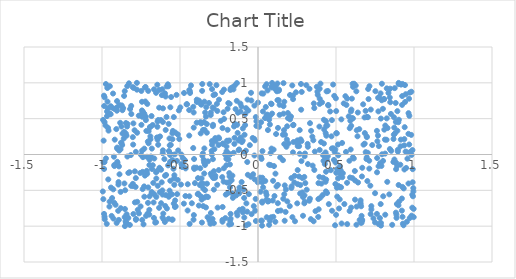
| Category | Series 0 |
|---|---|
| -0.7419592622740621 | 0.526 |
| -0.9224574481947303 | 0.639 |
| 0.9900379126059211 | 0.062 |
| 0.19145734107048473 | 0.579 |
| -0.692896978792227 | 0.382 |
| 0.6516120970148616 | -0.913 |
| -0.27252018202302786 | 0.186 |
| -0.37912200148637587 | -0.713 |
| 0.09034018760713414 | 0.998 |
| 0.5018132377319626 | -0.256 |
| -0.4097528813850355 | -0.063 |
| -0.9824699931598047 | -0.903 |
| 0.3877731138392537 | -0.399 |
| -0.35336066891110995 | 0.014 |
| 0.8254445727422417 | 0.923 |
| -0.8583453792873337 | 0.817 |
| 0.3503063440896721 | -0.155 |
| 0.8964751538222178 | 0.065 |
| 0.2885108013693589 | -0.855 |
| -0.9615182491556808 | 0.372 |
| -0.031243224011669346 | -0.276 |
| -0.3422164671219323 | 0.345 |
| -0.17495520618168836 | 0.922 |
| -0.8753606695693186 | 0.158 |
| -0.1535201118132965 | 0.391 |
| -0.2866530294697187 | -0.327 |
| -0.5730128356004565 | -0.897 |
| 0.7700742871777879 | 0.791 |
| -0.9352018048384272 | -0.608 |
| -0.19630874496795991 | -0.063 |
| 0.43960734681137104 | 0.881 |
| 0.809773972155627 | 0.347 |
| 0.1788386683228662 | -0.488 |
| 0.19586711586748673 | 0.154 |
| 0.06978973091221707 | -0.648 |
| -0.17991345490271704 | -0.457 |
| -0.8962989645703552 | -0.786 |
| -0.4650686677911722 | -0.579 |
| 0.17706164323828966 | -0.801 |
| -0.1128817470160759 | 0.71 |
| 0.11593899216185988 | 0.286 |
| 0.6158778797288358 | 0.988 |
| 0.054902587526479474 | -0.626 |
| 0.09667712032185727 | -0.367 |
| -0.18998940927837182 | -0.067 |
| -0.36294791596726417 | -0.403 |
| 0.20945528475894415 | 0.53 |
| 0.7881853355961057 | -0.992 |
| -0.8214644644003504 | -0.982 |
| -0.010057948386060334 | 0.464 |
| 0.9682957967996926 | 0.779 |
| 0.1620982211717037 | -0.617 |
| 0.5874195479520883 | -0.788 |
| -0.0620055426670143 | 0.614 |
| 0.21534800907295204 | -0.444 |
| -0.3672210025007123 | 0.295 |
| -0.2956415627918587 | 0.187 |
| -0.34567018217071266 | 0.453 |
| 0.298047839615762 | -0.57 |
| 0.05594308001573278 | -0.876 |
| -0.45802404658706375 | 0.7 |
| 0.4278964595079453 | -0.012 |
| -0.5619877390562702 | -0.556 |
| 0.8446974542959942 | 0.795 |
| 0.2785121831598616 | 0.187 |
| 0.8686584559352868 | 0.216 |
| 0.7941696146942545 | 0.987 |
| -0.5139606106078609 | 0.28 |
| -0.08814985319120949 | 0.024 |
| 0.12759738108346141 | -0.789 |
| -0.548787521978384 | -0.077 |
| 0.4472154085294555 | -0.025 |
| -0.3925031021179801 | 0.765 |
| 0.9124205803523109 | -0.143 |
| 0.31995739601439754 | -0.134 |
| -0.2268143012216799 | -0.732 |
| -0.17988417945567603 | -0.139 |
| -0.2910008774741235 | 0.656 |
| 0.41500358745609867 | -0.566 |
| -0.6824204750995548 | 0.537 |
| -0.9895193758236858 | 0.194 |
| -0.27497502581458155 | -0.325 |
| 0.21971282638853795 | 0.964 |
| -0.39290960556371557 | 0.444 |
| -0.8002764583468365 | 0.138 |
| 0.2637070391387264 | 0.116 |
| 0.6740269155728442 | 0.7 |
| -0.019458910715642874 | 0.199 |
| 0.6640934213020522 | -0.857 |
| -0.7248184025264413 | 0.936 |
| 0.18783860464966162 | -0.654 |
| -0.07778779154760862 | 0.053 |
| -0.5275563943293109 | -0.724 |
| -0.7473091323292089 | 0.414 |
| -0.4403549199226702 | 0.901 |
| 0.050552695488453425 | -0.528 |
| -0.22774819788274447 | -0.913 |
| -0.18179694166404992 | 0.707 |
| -0.1755120808628865 | -0.894 |
| 0.11374737613713326 | 0.958 |
| 0.6576050272658365 | -0.64 |
| -0.10571965605305556 | 0.67 |
| -0.6071142607168012 | -0.824 |
| 0.45399896636486825 | -0.692 |
| -0.5633327003689967 | 0.014 |
| 0.09820463811316915 | -0.87 |
| 0.8764020133276933 | 0.926 |
| -0.8581931480453582 | 0.316 |
| 0.2249125465899786 | 0.409 |
| -0.3582649208425792 | 0.888 |
| -0.10994754991100564 | 0.238 |
| -0.8751019522537704 | 0.39 |
| 0.9236885024983961 | 0.692 |
| -0.7011919525157724 | 0.156 |
| 0.08698411601906919 | 0.935 |
| -0.02309381248240916 | 0.682 |
| 0.6303880254238527 | 0.882 |
| -0.6751139364836027 | 0.411 |
| -0.48769725699299027 | -0.161 |
| 0.5054885175382411 | -0.463 |
| 0.8825761310856659 | 0.719 |
| -0.887805955583286 | -0.276 |
| -0.967951449244246 | 0.535 |
| -0.7373472389731623 | -0.037 |
| 0.026527241106605537 | -0.657 |
| 0.7061329814996458 | 0.914 |
| 0.6970741372478362 | -0.039 |
| 0.08093905705897031 | 0.019 |
| 0.5897937588133351 | -0.321 |
| 0.1923222302780132 | 0.507 |
| 0.18226322089184066 | 0.108 |
| -0.5741000127761857 | 0.952 |
| -0.6745292284743007 | -0.15 |
| -0.9393923898162049 | 0.656 |
| -0.03415295217127978 | 0.231 |
| 0.4515115445890019 | 0.684 |
| 0.4734611224209637 | 0.085 |
| -0.32792920189041985 | 0.425 |
| -0.7296527364150573 | -0.445 |
| -0.7397869474919905 | -0.242 |
| -0.0012790730268041894 | -0.388 |
| -0.577844096875173 | 0.979 |
| -0.13535828790830085 | -0.814 |
| -0.883408674532989 | 0.442 |
| 0.6309875293958656 | -0.98 |
| -0.6815280974094218 | -0.523 |
| -0.8119947530338196 | 0.565 |
| -0.5961331758318229 | 0.853 |
| 0.4004543324119392 | 0.989 |
| -0.6400126540349629 | 0.234 |
| -0.1361096204144001 | 0.749 |
| 0.7129101654087611 | -0.087 |
| 0.0637044750343223 | 0.341 |
| 0.5707796038125825 | -0.395 |
| -0.974984362475378 | 0.983 |
| -0.5837825350518167 | -0.753 |
| -0.7747040834856211 | 0.303 |
| 0.5402856334953476 | -0.317 |
| -0.22382896514738038 | 0.148 |
| 0.07135534169504831 | -0.982 |
| -0.8922152247099895 | -0.912 |
| -0.8313634906037779 | -0.886 |
| -0.6334518446544242 | 0.901 |
| 0.30319293733689 | -0.399 |
| 0.4221588835110932 | 0.485 |
| 0.10010675881117925 | 0.068 |
| 0.33290117389380547 | -0.617 |
| 0.4372514379817456 | -0.35 |
| -0.7337979022237249 | -0.974 |
| 0.913770094390314 | 0.114 |
| -0.010443508282033553 | 0.399 |
| 0.330168794611269 | 0.917 |
| 0.02630547750029444 | -0.388 |
| -0.8127948139783667 | -0.438 |
| 0.8933347383594938 | 0.605 |
| 0.7913955921467768 | -0.16 |
| -0.1437405509482239 | 0.633 |
| -0.36107636815228794 | -0.63 |
| 0.07627707393263261 | 0.418 |
| 0.8243399366199311 | 0.205 |
| 0.017558513424116517 | -0.039 |
| -0.25123655802703815 | -0.217 |
| 0.8134030971984172 | 0.208 |
| -0.9291681498835451 | 0.851 |
| 0.7134618145797678 | -0.197 |
| 0.514929787928375 | -0.438 |
| -0.05245249202164115 | 0.131 |
| 0.9954504098552726 | -0.469 |
| 0.3566018756156939 | -0.932 |
| -0.5365211458988692 | -0.423 |
| 0.8779513521450271 | 0.294 |
| 0.1632322606286496 | 0.57 |
| -0.4407655838045834 | 0.264 |
| 0.5127370093158081 | 0.139 |
| 0.7623159255015028 | 0.33 |
| -0.8948185511240181 | -0.419 |
| -0.6209684253541112 | -0.68 |
| 0.7863915257155385 | -0.692 |
| 0.059544213453866845 | 0.557 |
| -0.7428225611085286 | 0.054 |
| 0.7857833601394328 | 0.853 |
| -0.43708105007651477 | 0.882 |
| 0.8156713408371692 | -0.84 |
| -0.511804310198031 | 0.056 |
| -0.738218384755915 | 0.597 |
| -0.5960661894383847 | -0.297 |
| -0.1610276071896577 | -0.605 |
| 0.025851614498179742 | -0.992 |
| -0.4239624952284655 | -0.68 |
| 0.1026426373563647 | -0.162 |
| -0.7173511102701746 | -0.856 |
| 0.127559067741567 | -0.424 |
| -0.7115736108034596 | -0.032 |
| 0.9762979288619922 | 0.035 |
| -0.7438265213786353 | 0.615 |
| 0.560154380101439 | 0.814 |
| -0.3025353979758443 | -0.267 |
| -0.16556683776318826 | -0.542 |
| -0.621152240678519 | -0.212 |
| -0.2827098096729421 | -0.233 |
| -0.5638416392599599 | -0.103 |
| -0.7186987573590755 | 0.48 |
| 0.581806660819671 | 0.532 |
| -0.36870142881255874 | 0.452 |
| -0.798519032306892 | -0.83 |
| 0.649141740314849 | 0.354 |
| -0.4410388042559463 | 0.62 |
| 0.3859792602957075 | -0.871 |
| -0.6089908363230752 | 0.644 |
| 0.5357899938732624 | -0.963 |
| -0.5672853167449958 | 0.224 |
| 0.5004296161573121 | -0.842 |
| -0.42951541070734756 | 0.963 |
| -0.7437732933642593 | 0.736 |
| 0.4958701887380619 | 0.071 |
| -0.014877644562332204 | -0.62 |
| 0.0758799025636756 | -0.924 |
| 0.6904397039231676 | 0.033 |
| -0.639952495731489 | 0.136 |
| -0.9423811537736047 | -0.461 |
| 0.44446976888955647 | 0.405 |
| 0.6682684642435752 | -0.185 |
| 0.4338464027578317 | 0.298 |
| 0.9262972959296287 | -0.869 |
| 0.17331832030953676 | 0.277 |
| -0.17576092053555592 | -0.828 |
| -0.6341034222410065 | -0.744 |
| -0.40960842635361794 | -0.183 |
| 0.050007225352777906 | 0.663 |
| -0.7912020102577184 | 0.338 |
| 0.8159870458338008 | 0.404 |
| -0.7035703283927754 | -0.459 |
| -0.8034327568475383 | 0.94 |
| -0.9130584705123479 | -0.702 |
| 0.022706238876353035 | -0.061 |
| 0.18675297979101435 | 0.394 |
| -0.9028131651422575 | 0.096 |
| 0.08696659688197395 | 0.703 |
| -0.4689183460123947 | -0.079 |
| 0.9402473862712202 | 0.381 |
| -0.4861336423585907 | -0.175 |
| 0.007056439549803617 | 0.387 |
| 0.3952178406643412 | 0.064 |
| -0.609739230747228 | 0.454 |
| -0.8514379171635025 | -0.499 |
| 0.9174452235684616 | 0.975 |
| 0.033798269919053325 | 0.849 |
| -0.4111585970521514 | -0.845 |
| 0.3578191138719926 | 0.712 |
| 0.7638403168579482 | -0.049 |
| 0.8076677540215793 | 0.775 |
| 0.20364509477297577 | -0.721 |
| 0.05496600471319879 | 0.981 |
| -0.15146453833742402 | 0.148 |
| 0.11112122517448242 | -0.939 |
| -0.15583743491845525 | 0.023 |
| 0.6220081169565963 | -0.63 |
| 0.9918717762546907 | -0.205 |
| -0.12048422389815139 | -0.542 |
| -0.2977045962565743 | -0.295 |
| -0.3620233955944354 | 0.716 |
| -0.9696391890473215 | -0.968 |
| 0.1666600596742529 | 0.34 |
| 0.08100258652675474 | -0.148 |
| -0.9645531254994613 | 0.737 |
| 0.9422414405761113 | 0.969 |
| -0.6315876690306728 | -0.185 |
| 0.04510532814318835 | 0.508 |
| -0.7075072465110464 | -0.824 |
| 0.598784249300625 | 0.627 |
| -0.3669979746518406 | -0.583 |
| -0.198421662337519 | -0.392 |
| -0.22082307656954736 | 0.589 |
| -0.16510363691244057 | 0.936 |
| 0.9646711966473391 | -0.405 |
| -0.8014595879657764 | -0.439 |
| 0.02498715642765048 | -0.923 |
| 0.5535954330494945 | -0.691 |
| -0.5309709918463741 | -0.64 |
| -0.33366877566646647 | -0.738 |
| -0.7844382624619928 | -0.452 |
| -0.8024088088856156 | 0.242 |
| 0.5941622351139575 | 0.07 |
| -0.5184954710738077 | -0.553 |
| 0.41059798250057655 | 0.728 |
| 0.24321434167976164 | 0.868 |
| -0.22917295852076713 | -0.315 |
| -0.5590412958205631 | 0.134 |
| -0.20166558756247555 | 0.111 |
| -0.7740478625933485 | -0.66 |
| -0.8736825354793245 | 0.685 |
| -0.8468595314685958 | -0.951 |
| 0.7766195151749276 | 0.799 |
| -0.07432047607166137 | -0.682 |
| 0.9648595279697216 | 0.577 |
| 0.019656616921842396 | -0.923 |
| -0.88048322407087 | -0.522 |
| 0.13266233827820395 | 0.758 |
| 0.9222998934855073 | -0.614 |
| -0.5198356964810276 | -0.089 |
| 0.3932212576582885 | -0.312 |
| -0.2493165914873796 | 0.224 |
| -0.7103194285494352 | -0.269 |
| -0.08871731616362677 | -0.606 |
| 0.7879882488161192 | -0.955 |
| 0.5195921449839127 | -0.753 |
| -0.18408186083649425 | -0.26 |
| 0.15928639344429185 | 0.276 |
| -0.5361000522621282 | -0.289 |
| 0.37701995122662746 | 0.944 |
| -0.7988923646872186 | 0.434 |
| 0.022893289294451336 | 0.853 |
| 0.5052613270919384 | 0.296 |
| -0.8149442885702558 | -0.008 |
| -0.4909253062314327 | -0.134 |
| 0.08342197117659644 | 0.71 |
| -0.34456007891547835 | -0.265 |
| -0.6898794651005367 | 0.253 |
| -0.5719592739502593 | -0.59 |
| 0.4225116966658564 | 0.153 |
| -0.9183649711158308 | 0.207 |
| 0.8680567168401918 | -0.105 |
| 0.539214414592015 | 0.161 |
| 0.38889516399224977 | -0.764 |
| -0.8605220696513118 | 0.223 |
| -0.9060504675010148 | -0.955 |
| 0.2785605040633168 | -0.092 |
| 0.25462986125778597 | 0.117 |
| -0.19371502229920212 | 0.187 |
| 0.1710141927161093 | -0.924 |
| -0.014049261517898648 | 0.522 |
| 0.884092143142893 | -0.811 |
| -0.8798789856303397 | -0.749 |
| 0.5496158341723316 | 0.713 |
| -0.551527182617843 | -0.556 |
| -0.5399421916957219 | -0.685 |
| -0.5224691012783438 | 0.832 |
| -0.5457646715324238 | 0.329 |
| -0.3514163836330233 | -0.72 |
| -0.9914135884304671 | -0.623 |
| -0.2664116978468516 | 0.967 |
| -0.19450508795961885 | 0.344 |
| -0.9026734371863454 | 0.082 |
| 0.4330557521209202 | -0.381 |
| 0.98338189936256 | 0.876 |
| -0.6589449733409012 | -0.95 |
| 0.8903221094271714 | -0.691 |
| -0.11834181083544992 | -0.771 |
| 0.1344680583371345 | 0.905 |
| 0.9373691811217526 | 0.128 |
| 0.03163997417360931 | 0.601 |
| 0.9733199120245433 | 0.864 |
| -0.0981359053817723 | -0.758 |
| -0.5418079788695354 | -0.199 |
| -0.044745243491215 | 0.861 |
| 0.8716889278322879 | 0.52 |
| -0.33181142965644694 | 0.661 |
| 0.36862652486713277 | -0.79 |
| -0.49783644665301585 | 0.658 |
| -0.3029720635123576 | 0.55 |
| -0.28904040341591086 | -0.065 |
| 0.794929041991969 | 0.003 |
| -0.9657724257301443 | 0.928 |
| 0.055459313728407844 | 0.548 |
| -0.8706536821690523 | 0.132 |
| -0.1769953222485663 | 0.9 |
| 0.8705971065008011 | 0.277 |
| -0.21875621702920678 | -0.191 |
| 0.15989778538176536 | -0.079 |
| 0.4626443035288339 | 0.6 |
| 0.4916654831877443 | 0.035 |
| 0.1685352029373457 | 0.146 |
| -0.32079401853728706 | -0.593 |
| -0.9872287095123333 | 0.821 |
| 0.07150463085378433 | 0.485 |
| 0.14594159681681695 | -0.781 |
| 0.8286489315428309 | -0.382 |
| -0.6172821382799516 | -0.388 |
| -0.5917632607953516 | 0.342 |
| 0.04662191396479032 | -0.369 |
| 0.2967919207284535 | -0.313 |
| -0.6953358153030578 | -0.074 |
| -0.6953647665227596 | -0.584 |
| 0.9729061247648232 | -0.886 |
| 0.6225720574102751 | -0.363 |
| 0.6016804414576549 | 0.78 |
| -0.8529214042512046 | -0.76 |
| -0.2382703761060061 | 0.469 |
| -0.8391493986116236 | 0.391 |
| -0.32064512317940497 | -0.096 |
| -0.41518651823574126 | 0.09 |
| -0.6117017176137587 | -0.879 |
| -0.8019234842479637 | -0.409 |
| -0.7762306679887121 | 1 |
| -0.6971249905616328 | -0.838 |
| 0.4174635474832249 | -0.324 |
| 0.996079547309056 | -0.516 |
| 0.5919220545585038 | 0.471 |
| 0.11188412756164245 | -0.267 |
| 0.6568639354322687 | -0.671 |
| -0.949661466202919 | 0.953 |
| 0.5250808514943375 | -0.455 |
| -0.3636155919734507 | 0.702 |
| -0.6656416652780541 | -0.553 |
| -0.11721445401484498 | 0.212 |
| 0.3122622193156197 | -0.491 |
| 0.4887286853066437 | 0.818 |
| -0.2524611145187847 | 0.237 |
| -0.22959283677820275 | 0.872 |
| 0.47451265068488 | -0.785 |
| -0.622378064579167 | 0.481 |
| -0.9205626257797153 | -0.161 |
| -0.9211584771259815 | -0.146 |
| -0.00015094350445377103 | 0.724 |
| -0.6966113374229781 | -0.771 |
| -0.06518228861403852 | -0.283 |
| 0.4356317583543199 | 0.464 |
| 0.4201545836254874 | -0.089 |
| -0.7250046101619974 | -0.295 |
| 0.5639235552875039 | 0.035 |
| 0.9496588656697684 | -0.188 |
| 0.8415888602816102 | -0.556 |
| -0.35306350121922225 | -0.405 |
| -0.3109541909106017 | -0.922 |
| -0.5379067195915228 | -0.333 |
| -0.19027260288593117 | 0.718 |
| -0.12508955854760373 | -0.514 |
| 0.5972361887296662 | -0.74 |
| 0.21413020170595876 | -0.467 |
| 0.4961099405215579 | -0.412 |
| 0.6378478807467562 | 0.254 |
| -0.7285898289810615 | -0.589 |
| -0.34345214068926144 | -0.602 |
| -0.3593861241982137 | -0.949 |
| 0.3951222082529384 | 0.706 |
| 0.23718495835427333 | -0.931 |
| 0.20530815634267774 | 0.491 |
| 0.4239543434743276 | 0.35 |
| -0.5924506958648137 | 0.809 |
| 0.6412241876889904 | -0.391 |
| -0.604927017181587 | -0.905 |
| 0.48165383374549253 | 0.976 |
| -0.34803849171174606 | -0.073 |
| -0.413378422047638 | -0.91 |
| 0.30127231016658396 | 0.013 |
| -0.32324749190969526 | -0.876 |
| 0.02851452050507919 | 0.048 |
| -0.6534982321699692 | 0.861 |
| -0.831189514127096 | -0.257 |
| 0.6048587932097289 | -0.329 |
| -0.7219150262755369 | 0.74 |
| -0.49364231599610076 | -0.419 |
| -0.7548256326342688 | -0.257 |
| -0.2587167873091636 | -0.741 |
| 0.18517440059897483 | 0.209 |
| 0.25456167493769555 | -0.414 |
| -0.1401262089593578 | -0.571 |
| -0.19834230123249208 | 0.192 |
| 0.2711832831010399 | -0.427 |
| 0.6965359534817808 | 0.253 |
| -0.43824233653321953 | -0.969 |
| -0.6336520394842833 | 0.653 |
| -0.2022722752699171 | -0.15 |
| -0.4640216274552533 | -0.194 |
| -0.5073282496150779 | 0.616 |
| -0.3052827733644028 | -0.966 |
| 0.901772517449124 | 0.999 |
| 0.8541296513123215 | 0.051 |
| 0.9578391403100159 | -0.058 |
| 0.49713939642623184 | -0.112 |
| 0.6094979362194222 | 0.943 |
| -0.4511590715768605 | -0.781 |
| -0.3616924497240095 | -0.334 |
| 0.29873191171969715 | -0.025 |
| 0.49396541519416814 | -0.987 |
| 0.40693659267941773 | -0.406 |
| -0.9930317310756303 | 0.482 |
| 0.2730705340836814 | 0.211 |
| -0.5149172343198132 | -0.354 |
| -0.2795939089882422 | 0.075 |
| 0.8015371246648337 | -0.089 |
| 0.3333658398200623 | 0.437 |
| 0.3952118491885128 | 0.917 |
| -0.1502957714362596 | 0.233 |
| -0.6448496154943597 | 0.387 |
| 0.9913087796212636 | -0.388 |
| 0.4045137262886176 | 0.174 |
| 0.38693945344744907 | -0.622 |
| -0.6532148383942029 | -0.945 |
| -0.4914655428017509 | 0 |
| 0.36087261585093544 | 0.648 |
| 0.9701877658574891 | 0.54 |
| -0.22758512715639334 | 0.368 |
| -0.4149358949048001 | 0.665 |
| -0.97772287167887 | 0.405 |
| -0.7422777606167146 | -0.913 |
| -0.7498988167099687 | -0.005 |
| 0.8473183985653141 | 0.919 |
| 0.8081955323427268 | 0.772 |
| 0.6032912141113218 | 0.507 |
| -0.2945918747152292 | 0.137 |
| -0.9382394679263331 | -0.857 |
| 0.1334474012953497 | 0.89 |
| -0.7479822024871219 | 0.887 |
| 0.3002680409846741 | -0.66 |
| 0.6764962719084606 | 0.138 |
| 0.3181240136835026 | 0.148 |
| -0.3846113517393006 | -0.329 |
| 0.9468368040743416 | 0.841 |
| 0.16861715377874975 | 0.736 |
| 0.772706266503079 | -0.164 |
| 0.8852014899469345 | -0.114 |
| 0.9848367914222029 | -0.853 |
| -0.2956023453719978 | -0.001 |
| -0.33974369083625944 | -0.146 |
| 0.7085068523617766 | 0.773 |
| 0.8007465098936333 | 0.637 |
| -0.28474006611734115 | -0.321 |
| -0.827380573405895 | 0.993 |
| 0.2801556039344506 | 0.873 |
| 0.6830432698920985 | 0.517 |
| 0.2766958862325879 | 0.625 |
| -0.7062046958494086 | 0.18 |
| 0.9341331562158146 | -0.473 |
| 0.5717973683775075 | -0.971 |
| 0.8251818951295209 | 0.504 |
| 0.5327241768250872 | -0.457 |
| -0.6094878829133876 | 0.058 |
| -0.2202434027442861 | -0.379 |
| 0.4827462181994764 | 0.086 |
| -0.7478149945529691 | 0.558 |
| -0.45041701826438296 | -0.415 |
| -0.5484249716325296 | 0.213 |
| -0.6137811964653932 | 0.91 |
| 0.8304321867657933 | 0.369 |
| 0.4350791778137175 | -0.515 |
| -0.06881202349293658 | -0.105 |
| -0.9444893096692055 | 0.562 |
| 0.46696650433191667 | -0.219 |
| -0.6666845453027552 | 0.909 |
| -0.27405553027146956 | 0.229 |
| 0.5254866014593604 | -0.166 |
| 0.22425162462740933 | 0.03 |
| 0.16831892479283495 | -0.555 |
| -0.3943564831779167 | -0.183 |
| -0.013481610050437132 | -0.928 |
| -0.018219509189333127 | -0.785 |
| -0.07570148961304657 | -0.988 |
| 0.054926313390855075 | -0.564 |
| -0.7524847864254045 | -0.724 |
| -0.645457266408058 | 0.973 |
| 0.7503491277434857 | -0.54 |
| 0.5342985092005372 | 0.49 |
| -0.9214431731123687 | -0.674 |
| 0.1384285538212784 | 0.554 |
| -0.6464923478368358 | -0.23 |
| -0.6961271800528179 | -0.147 |
| 0.214044375326369 | -0.328 |
| -0.30942429158035334 | -0.895 |
| -0.273731314250546 | -0.296 |
| -0.9036024611204367 | 0.745 |
| -0.3020331690603133 | -0.817 |
| 0.01591903123273042 | -0.029 |
| 0.10563725408294045 | -0.58 |
| -0.475166217919617 | -0.686 |
| -0.10490316628308394 | -0.385 |
| -0.9524291669957028 | -0.726 |
| -0.48114175099548917 | -0.051 |
| 0.997718951948023 | -0.759 |
| -0.7393512462224454 | -0.482 |
| -0.7830347100328199 | 0.037 |
| -0.6115841791468686 | -0.56 |
| -0.7761454349006742 | 0.905 |
| 0.620830550599776 | -0.23 |
| 0.09466866385595663 | -0.642 |
| -0.6712099085127559 | -0.397 |
| -0.9902391605394443 | -0.11 |
| -0.44004399372978953 | -0.583 |
| -0.3510939690492738 | -0.473 |
| 0.9981842914057721 | -0.874 |
| -0.8544852794075541 | -0.874 |
| -0.6809132160797171 | -0.543 |
| -0.6398392251380249 | 0.482 |
| 0.3808408833553103 | 0.876 |
| 0.22470124320292584 | 0.772 |
| -0.09719613196342447 | 0.364 |
| -0.11204823495697691 | 0.6 |
| 0.2634640106101429 | -0.307 |
| -0.8897602165796614 | 0.054 |
| 0.08646442607569083 | 0.082 |
| -0.1689557926139169 | -0.359 |
| 0.7266877140804631 | -0.766 |
| -0.7123987420033717 | -0.228 |
| 0.7322854975029627 | 0.132 |
| 0.36420146477637894 | 0.041 |
| -0.4355757007983718 | 0.858 |
| 0.5078992048693554 | -0.588 |
| -0.1818909233411743 | -0.385 |
| -0.596895269701202 | -0.941 |
| -0.08777649400871779 | -0.88 |
| 0.06350034451358022 | -0.656 |
| -0.8771404482574978 | 0.165 |
| -0.923645111753832 | -0.031 |
| -0.13205832978372634 | -0.85 |
| 0.6846980953364818 | 0.299 |
| -0.842166125387076 | -0.834 |
| 0.9030532298613054 | 0.485 |
| -0.8540496935976105 | 0.885 |
| -0.6894000866011998 | 0.212 |
| 0.9543957579888003 | -0.939 |
| -0.16421700845365494 | -0.295 |
| -0.8564013158996122 | -0.404 |
| -0.3639902653383711 | 0.696 |
| 0.297101979337961 | -0.681 |
| 0.7144544717562931 | 0.953 |
| -0.33870695618966495 | 0.586 |
| 0.16361180867216651 | 0.996 |
| -0.894157091986223 | -0.385 |
| 0.769115848898364 | 0.264 |
| -0.04261967212661033 | 0.753 |
| 0.13850295459314044 | 0.693 |
| -0.14813324645340842 | 0.426 |
| 0.9288151172419985 | -0.966 |
| -0.5668095645997082 | -0.505 |
| -0.763156929172047 | -0.822 |
| 0.07686615584841161 | 0.54 |
| -0.8408010610632308 | -0.961 |
| -0.3916396249101812 | 0.732 |
| 0.03293497868786588 | -0.458 |
| 0.12474368301809924 | 0.991 |
| -0.2850887992176476 | 0.828 |
| -0.04086192982539161 | -0.832 |
| -0.5509794255396459 | -0.91 |
| 0.5719960607106322 | 0.78 |
| -0.8127717282269267 | 0.678 |
| -0.06693365859130584 | 0.766 |
| 0.6265360029296456 | 0.963 |
| -0.7641024747234777 | 0.541 |
| 0.393578685257975 | 0.389 |
| -0.642636612632449 | -0.437 |
| -0.021303217192144563 | -0.346 |
| 0.8026827282410636 | -0.583 |
| -0.7194627484471405 | 0.528 |
| -0.40427041145591636 | -0.399 |
| -0.504602856778608 | 0.215 |
| 0.11875005415427209 | -0.446 |
| -0.6804704541294808 | 0.082 |
| 0.5286672250713607 | -0.272 |
| -0.2829446952774044 | -0.49 |
| 0.5668031519207852 | 0.691 |
| 0.5957682385607286 | 0.602 |
| 0.5012371678489047 | 0.606 |
| -0.5295099371906828 | 0.306 |
| -0.19227856250515063 | 0.018 |
| 0.17137946538184834 | -0.431 |
| -0.6516923249923701 | -0.335 |
| 0.4737767960341057 | 0.48 |
| -0.7095558237920885 | 0.705 |
| -0.11884646898944551 | -0.461 |
| -0.9580294387441197 | 0.333 |
| -0.5337447358546508 | 0.001 |
| 0.44843627394189123 | 0.886 |
| -0.34345714042615616 | 0.737 |
| -0.022787169225158 | -0.014 |
| -0.888683928655595 | 0.69 |
| 0.27553673362883946 | 0.984 |
| 0.9258986774402787 | -0.453 |
| -0.591175107857131 | -0.566 |
| -0.5568874495964045 | 0.802 |
| -0.18433045631743306 | -0.977 |
| -0.9008506609736857 | -0.118 |
| -0.9620035895641796 | 0.645 |
| 0.09040022597320463 | 0.571 |
| -0.5944935134549254 | -0.718 |
| -0.20268676304409516 | -0.059 |
| 0.07122230944815433 | -0.143 |
| -0.6292924179703074 | -0.526 |
| 0.5860293527952785 | -0.087 |
| -0.12468811381958633 | 0.196 |
| -0.6535799355011109 | -0.248 |
| 0.22738186811151273 | 0.415 |
| -0.8198394453774598 | 0.635 |
| 0.045544290593818815 | 0.95 |
| -0.07629865353428555 | 0.646 |
| -0.2916257225814103 | -0.9 |
| -0.3095590103574597 | 0.982 |
| 0.4867930467642412 | -0.075 |
| 0.3956816902689031 | 0.777 |
| -0.8464634127177766 | 0.439 |
| 0.23289356438772923 | -0.389 |
| 0.984160210775396 | -0.006 |
| -0.5855114196468352 | 0.95 |
| -0.19382141921598195 | -0.541 |
| 0.7824894053013403 | -0.122 |
| 0.43086474962410737 | -0.072 |
| 0.3547081641045229 | 0.198 |
| 0.7933426727647648 | 0.757 |
| 0.3387203389671487 | -0.902 |
| 0.6399038464152105 | 0.586 |
| -0.6002273063432122 | -0.064 |
| -0.08180270463206107 | 0.564 |
| 0.6142689355902482 | -0.055 |
| 0.8452215211662504 | 0.076 |
| 0.9153756208398094 | 0.207 |
| -0.9866106546973734 | -0.202 |
| 0.697964031203326 | 0.242 |
| -0.6439040233890974 | 0.206 |
| -0.4086747019278436 | -0.201 |
| -0.8372536283123932 | -0.028 |
| 0.4993272610798283 | 0.785 |
| 0.9461626934283405 | 0.041 |
| 0.12477462958388386 | 0.758 |
| -0.34379366205442374 | 0.085 |
| 0.10522086021026267 | 0.956 |
| 0.7264237979552617 | -0.72 |
| -0.0461671986326504 | -0.31 |
| -0.9513139813982976 | -0.657 |
| 0.12817652705012028 | 0.371 |
| 0.8834886669083437 | 0.454 |
| -0.12425235174838911 | 0.061 |
| 0.5237869828573505 | -0.627 |
| 0.4330148324901011 | 0.029 |
| 0.25440318656335625 | -0.217 |
| -0.38620194027690946 | -0.553 |
| -0.8488535215661259 | -0.93 |
| 0.5135073770951812 | -0.333 |
| 0.847798660981931 | 0.729 |
| 0.6839959095921093 | 0.151 |
| -0.7036038100782689 | 0.887 |
| 0.6081936383942741 | -0.039 |
| -0.5621111462420896 | 0.01 |
| 0.08402559424895761 | -0.876 |
| -0.35662801017860124 | -0.017 |
| -0.34449329217680225 | -0.117 |
| 0.061299417775576126 | 0.894 |
| -0.5725857010483055 | 0.427 |
| 0.9428729862935386 | 0.733 |
| 0.01255854383189181 | -0.323 |
| 0.7201349473792129 | -0.435 |
| 0.7651610275886782 | 0.185 |
| -0.2839240120860005 | 0.646 |
| 0.9329475945216799 | -0.987 |
| 0.40035073216940553 | -0.601 |
| -0.8468940955711057 | 0.292 |
| 0.6574262480118429 | -0.692 |
| -0.6440266343301837 | 0.459 |
| -0.08243359671865269 | 0.411 |
| 0.6674821145414465 | -0.925 |
| 0.8934016096140049 | 0.331 |
| 0.6983244754880016 | 0.523 |
| 0.7045053625666888 | 0.521 |
| -0.30231150856106237 | 0.585 |
| -0.8812673720851625 | 0.073 |
| 0.7814867203623641 | -0.887 |
| -0.8644009834545014 | 0.648 |
| 0.982093991170141 | 0.273 |
| 0.8743827301002753 | -0.07 |
| 0.2841136588237434 | -0.53 |
| 0.6899102165970836 | 0.609 |
| -0.058520551814359445 | -0.553 |
| -0.3270342908582886 | -0.407 |
| 0.2514645850763677 | -0.682 |
| 0.4410941496990586 | -0.071 |
| -0.1353003510302313 | 0.997 |
| 0.7717324819281117 | 0.602 |
| -0.7832859506665582 | -0.329 |
| 0.9644941857369187 | 0.288 |
| -0.6895090838424178 | 0.386 |
| -0.7288885942065522 | 0.57 |
| 0.9555271507381189 | 0.029 |
| 0.44253843528814096 | -0.537 |
| -0.26352215989188754 | 0.706 |
| 0.2349286974482927 | -0.298 |
| 0.7878236185539325 | 0.501 |
| 0.437379188182889 | 0.4 |
| 0.7222886601192864 | -0.832 |
| -0.9834993714998248 | 0.452 |
| -0.926811357182254 | -0.894 |
| -0.41202984997010694 | 0.375 |
| -0.06104498440825368 | -0.973 |
| 0.8918495878809749 | -0.157 |
| 0.5438868525741047 | -0.261 |
| -0.9836220195711898 | -0.105 |
| 0.6611051710824605 | -0.722 |
| 0.8362523303047278 | 0.858 |
| 0.42816795644612804 | -0.133 |
| 0.9693007370322086 | 0.139 |
| -0.5710952259629489 | 0.049 |
| 0.22800259528882383 | 0.174 |
| -0.9045725986993995 | 0.611 |
| 0.7748049066845986 | 0.117 |
| -0.357123800617309 | 0.983 |
| 0.4494569918566196 | 0.691 |
| 0.02723252626155581 | -0.672 |
| -0.9747019562664689 | -0.054 |
| -0.3337765516947824 | 0.529 |
| -0.3719780953171776 | -0.428 |
| 0.2099979240161145 | 0.529 |
| -0.4124374591623403 | 0.586 |
| -0.612702685916896 | -0.501 |
| 0.9890254261798381 | -0.562 |
| -0.838152453655012 | 0.955 |
| 0.6639641114640078 | -0.952 |
| -0.9276689401314879 | -0.487 |
| -0.6518546397086618 | -0.592 |
| -0.8913335008126579 | -0.166 |
| -0.454818347003741 | 0.702 |
| -0.6106272127139756 | 0.017 |
| 0.8965342775511487 | 0.04 |
| -0.8231228210555439 | -0.247 |
| 0.9003604641737195 | -0.709 |
| -0.8686177839701208 | 0.293 |
| -0.2972336594919913 | 0.048 |
| 0.2842873884477497 | -0.328 |
| 0.01598305714379733 | -0.52 |
| 0.922182407541212 | -0.783 |
| -0.21742812493458885 | 0.496 |
| 0.7623622199157318 | -0.829 |
| 0.8873077125324027 | -0.838 |
| -0.5396688916945773 | 0.522 |
| 0.7229390448898876 | 0.627 |
| -0.9868621037353138 | -0.829 |
| -0.08612644043258277 | 0.275 |
| -0.9597746262945188 | -0.348 |
| -0.28824586105872374 | 0.415 |
| -0.7820227340431749 | -0.899 |
| -0.34496673627162266 | -0.097 |
| -0.7202666476324526 | 0.942 |
| 0.43577240167881115 | -0.24 |
| -0.20163491664548427 | 0.045 |
| 0.666347642011631 | -0.306 |
| 0.4709410081722434 | 0.254 |
| 0.267190902224969 | 0.01 |
| -0.950226330656458 | 0.571 |
| -0.25004624107511875 | 0.765 |
| -0.8692270069241683 | 0.618 |
| 0.7502897794982379 | -0.947 |
| -0.3142269779263833 | 0.719 |
| -0.027028270138092614 | -0.721 |
| -0.842866301676382 | 0.263 |
| -0.5864156759223058 | 0.524 |
| 0.7740935610012516 | -0.971 |
| -0.09174455410863058 | -0.489 |
| 0.938022063180538 | 0.215 |
| 0.10946966878433151 | 0.914 |
| 0.9242577664821541 | 0.815 |
| 0.9933331699906707 | -0.583 |
| 0.8878397351541951 | -0.884 |
| 0.5881354867037405 | 0.367 |
| -0.19508238569448033 | 0.638 |
| -0.09664679664804732 | -0.807 |
| -0.21796241145110185 | 0.905 |
| -0.9434612147738499 | 0.673 |
| -0.28289632903329376 | -0.958 |
| 0.22052168943781725 | -0.874 |
| 0.5013512453816589 | 0.297 |
| -0.208927854863314 | -0.887 |
| 0.8519962163898944 | 0.566 |
| 0.3289882117743943 | -0.645 |
| -0.6692679898107352 | -0.669 |
| 0.8851964636253853 | -0.205 |
| 0.6087939966194889 | 0.504 |
| 0.8734902042535895 | 0.375 |
| -0.9082458958581316 | 0.355 |
| 0.26731656269129367 | 0.34 |
| 0.383014330440266 | 0.832 |
| -0.7964553203649058 | 0.929 |
| -0.5889667405634584 | -0.285 |
| 0.9014108863367034 | -0.425 |
| -0.26127734873515585 | -0.423 |
| -0.474071648038094 | 0.858 |
| 0.6676745050996049 | -0.911 |
| -0.5761220071322901 | -0.151 |
| -0.6476988628976035 | 0.237 |
| -0.14934986008230244 | 0.962 |
| 0.9262682465333592 | 0.984 |
| 0.12711914246817524 | -0.68 |
| 0.5974111978814765 | 0.4 |
| -0.28950989208821576 | 0.396 |
| -0.7890251213644348 | -0.668 |
| -0.024950911296543365 | 0.218 |
| 0.4172038436214387 | -0.009 |
| 0.9891307800122626 | -0.742 |
| -0.967679059476592 | 0.599 |
| -0.37886757243501057 | 0.753 |
| 0.8148424023625538 | 0.013 |
| -0.12045668841123192 | 0.07 |
| 0.65990023353076 | -0.952 |
| -0.5658581999580552 | 0.128 |
| -0.983297964359672 | 0.797 |
| 0.2886267305346071 | -0.594 |
| 0.7631061214326054 | -0.249 |
| 0.7010429362727724 | -0.371 |
| 0.22429330729521868 | 0.823 |
| 0.08865547385391537 | 0.95 |
| 0.1421751115369272 | -0.041 |
| 0.7525119865223486 | 0.884 |
| -0.2062499466516179 | -0.56 |
| -0.18402521153007623 | 0.195 |
| -0.5632501078107155 | -0.008 |
| 0.16362475424502954 | 0.675 |
| -0.13322041063709067 | 0.414 |
| 0.695173962861179 | -0.063 |
| 0.6322062219403128 | -0.727 |
| 0.30984260620968085 | 0.967 |
| -0.5324947190013096 | -0.733 |
| 0.5145339305092724 | -0.012 |
| 0.3403766359213154 | 0.33 |
| -0.4823505106875068 | -0.156 |
| -0.9860336800598679 | 0.677 |
| -0.13056561047334925 | 0.301 |
| 0.20519776462522166 | 0.83 |
| -0.25260750301406776 | 0.133 |
| 0.12100332492355537 | 0.882 |
| -0.8530861703203241 | -0.999 |
| -0.6648509703988645 | -0.056 |
| 0.7036180887606924 | 0.024 |
| -0.1033683113680548 | 0.173 |
| 0.43798938716943603 | 0.262 |
| -0.5619206762882163 | 0.659 |
| -0.9020920731047011 | -0.102 |
| -0.0980772943464212 | 0.194 |
| -0.6159409728463721 | 0.829 |
| -0.9948596770484339 | -0.516 |
| -0.3833112396299063 | -0.549 |
| -0.7052356603034706 | -0.675 |
| -0.5473750381930622 | -0.908 |
| 0.9384278756971072 | -0.209 |
| -0.2256597390548547 | 0.154 |
| 0.2519644744130347 | 0.196 |
| -0.7824901471657397 | -0.911 |
| -0.27548174645525547 | 0.839 |
| -0.17880793715170618 | -0.921 |
| 0.36099276094927646 | -0.216 |
| -0.17209477319856514 | -0.97 |
| 0.31958250188697823 | 0.108 |
| 0.6328952944659565 | 0.338 |
| -0.17799579933239795 | 0.003 |
| -0.3522629354355815 | 0.342 |
| -0.715664147442159 | 0.329 |
| -0.9042004067711602 | 0.656 |
| 0.019908908014015347 | 0.45 |
| -0.32796397850934556 | 0.304 |
| -0.7893614263548749 | -0.235 |
| -0.6867641901289385 | -0.028 |
| -0.3642277152976139 | 0.434 |
| 0.2700055111319768 | -0.544 |
| -0.2277588008669722 | -0.938 |
| -0.3702748565589924 | -0.192 |
| -0.33976177688296794 | -0.497 |
| -0.15755811473810932 | 0.909 |
| -0.1822837166896607 | -0.306 |
| 0.7400272371683918 | -0.891 |
| -0.5621741702754401 | -0.367 |
| -0.2110107306930309 | 0 |
| -0.9834941740096019 | -0.869 |
| 0.2575557443908807 | 0.192 |
| 0.507662336956564 | -0.205 |
| 0.25535333330547183 | 0.144 |
| 0.3484048035071188 | 0.249 |
| -0.26092290428835674 | 0.608 |
| 0.9045580366805375 | -0.656 |
| -0.12865213310630774 | 0.583 |
| 0.5297611893891196 | -0.22 |
| 0.8602283917545281 | -0.981 |
| 0.8996247002915949 | 0.45 |
| -0.6670778041166818 | -0.885 |
| 0.027846498230147176 | -0.324 |
| -0.0693224095274576 | -0.797 |
| -0.7706340863482326 | -0.773 |
| -0.6277691994732837 | 0.252 |
| -0.6792811392873392 | -0.202 |
| -0.549050358478167 | 0.296 |
| -0.7010061773264755 | 0.325 |
| 0.9021612655077491 | 0.982 |
| -0.2946263315896005 | 0.912 |
| 0.6063227893847307 | 0.986 |
| -0.33180161072551684 | -0.586 |
| -0.8370685738893333 | 0.426 |
| -0.7286986011924694 | 0.082 |